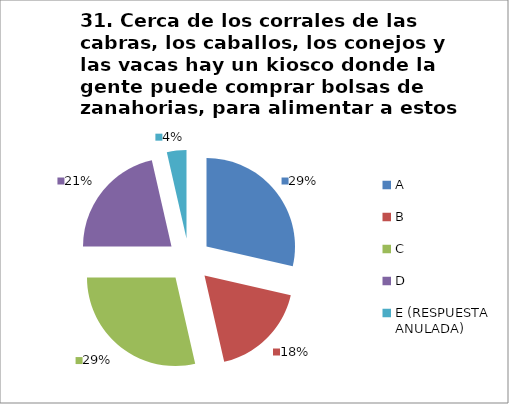
| Category | CANTIDAD DE RESPUESTAS PREGUNTA (31) | PORCENTAJE |
|---|---|---|
| A | 8 | 0.286 |
| B | 5 | 0.179 |
| C | 8 | 0.286 |
| D | 6 | 0.214 |
| E (RESPUESTA ANULADA) | 1 | 0.036 |